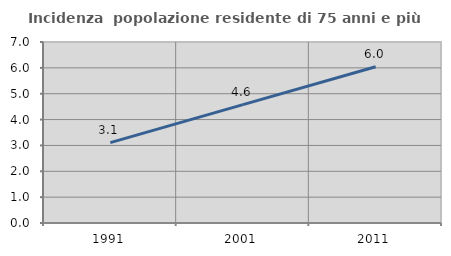
| Category | Incidenza  popolazione residente di 75 anni e più |
|---|---|
| 1991.0 | 3.109 |
| 2001.0 | 4.578 |
| 2011.0 | 6.045 |